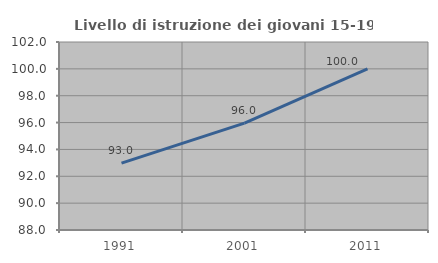
| Category | Livello di istruzione dei giovani 15-19 anni |
|---|---|
| 1991.0 | 92.982 |
| 2001.0 | 95.96 |
| 2011.0 | 100 |